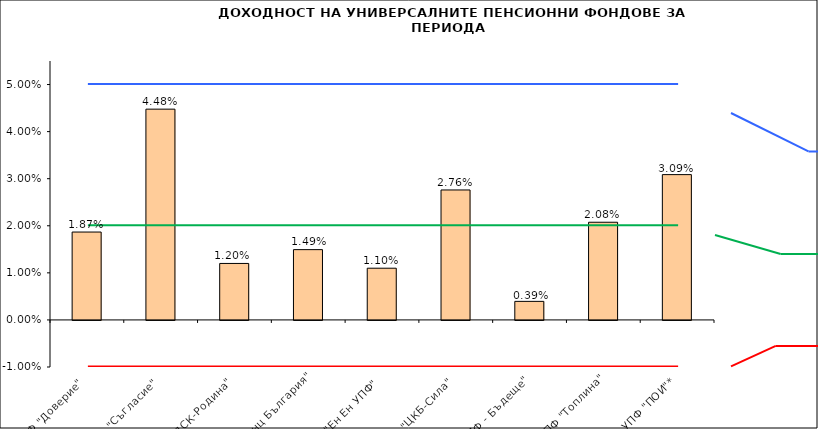
| Category | Series 0 |
|---|---|
| УПФ "Доверие"  | 0.019 |
| УПФ "Съгласие"  | 0.045 |
| УПФ "ДСК-Родина"  | 0.012 |
| "ЗУПФ Алианц България" | 0.015 |
| "Eн Ен УПФ"  | 0.011 |
| УПФ "ЦКБ-Сила"  | 0.028 |
| "УПФ - Бъдеще" | 0.004 |
| УПФ "Топлина" | 0.021 |
| УПФ "ПОИ"* | 0.031 |